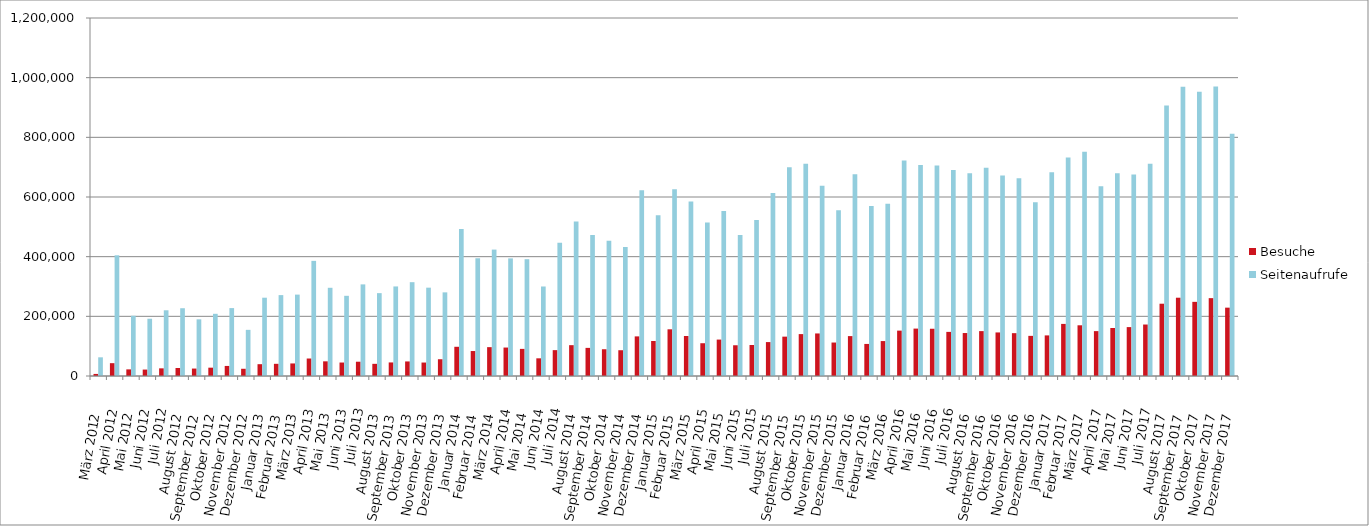
| Category | Besuche | Seitenaufrufe |
|---|---|---|
| März 2012 | 6943 | 62624 |
| April 2012 | 43005 | 404601 |
| Mai 2012 | 22213 | 201883 |
| Juni 2012 | 21538 | 191910 |
| Juli 2012 | 25663 | 220272 |
| August 2012 | 26886 | 227171 |
| September 2012 | 24946 | 189987 |
| Oktober 2012 | 27894 | 208476 |
| November 2012 | 33726 | 227625 |
| Dezember 2012 | 24211 | 154701 |
| Januar 2013 | 39603 | 262444 |
| Februar 2013 | 40839 | 271129 |
| März 2013 | 42087 | 272807 |
| April 2013 | 58626 | 385939 |
| Mai 2013 | 49164 | 295672 |
| Juni 2013 | 45159 | 268793 |
| Juli 2013 | 47877 | 307104 |
| August 2013 | 40778 | 277744 |
| September 2013 | 45468 | 300214 |
| Oktober 2013 | 48811 | 314477 |
| November 2013 | 45121 | 296074 |
| Dezember 2013 | 56175 | 280331 |
| Januar 2014 | 97924 | 492424 |
| Februar 2014 | 83683 | 394664 |
| März 2014 | 96713 | 423735 |
| April 2014 | 95384 | 394247 |
| Mai 2014 | 90888 | 391522 |
| Juni 2014 | 59279 | 300029 |
| Juli 2014 | 86699 | 446848 |
| August 2014 | 103346 | 517631 |
| September 2014 | 94246 | 472291 |
| Oktober 2014 | 89691 | 453092 |
| November 2014 | 86401 | 432732 |
| Dezember 2014 | 132768 | 622578 |
| Januar 2015 | 117395 | 538775 |
| Februar 2015 | 156512 | 625973 |
| März 2015 | 133994 | 584660 |
| April 2015 | 109853 | 514135 |
| Mai 2015 | 122089 | 553263 |
| Juni 2015 | 103030 | 472546 |
| Juli 2015 | 103926 | 523153 |
| August 2015 | 113701 | 613502 |
| September 2015 | 131930 | 699641 |
| Oktober 2015 | 140445 | 711554 |
| November 2015 | 142626 | 637601 |
| Dezember 2015 | 112183 | 555322 |
| Januar 2016 | 133725 | 675845 |
| Februar 2016 | 107472 | 570076 |
| März 2016 | 117088 | 576966 |
| April 2016 | 152084 | 722692 |
| Mai 2016 | 158904 | 707510 |
| Juni 2016 | 158379 | 705549 |
| Juli 2016 | 147857 | 690315 |
| August 2016 | 144036 | 679626 |
| September 2016 | 150456 | 698220 |
| Oktober 2016 | 146002 | 672331 |
| November 2016 | 143602 | 663080 |
| Dezember 2016 | 134534 | 582768 |
| Januar 2017 | 136102 | 682653 |
| Februar 2017 | 174615 | 732680 |
| März 2017 | 169966 | 751740 |
| April 2017 | 150456 | 635676 |
| Mai 2017 | 160931 | 679239 |
| Juni 2017 | 163908 | 675413 |
| Juli 2017 | 172534 | 711801 |
| August 2017 | 242295 | 906661 |
| September 2017 | 262407 | 969540 |
| Oktober 2017 | 248556 | 952736 |
| November 2017 | 260969 | 970237 |
| Dezember 2017 | 229095 | 811601 |